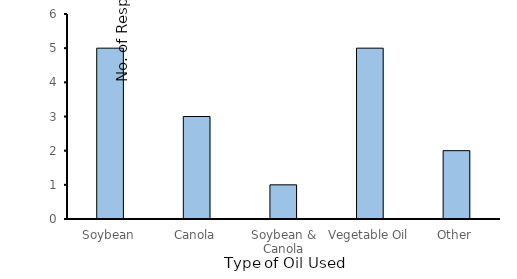
| Category | Series 0 |
|---|---|
| Soybean | 5 |
| Canola | 3 |
| Soybean & Canola | 1 |
| Vegetable Oil | 5 |
| Other | 2 |